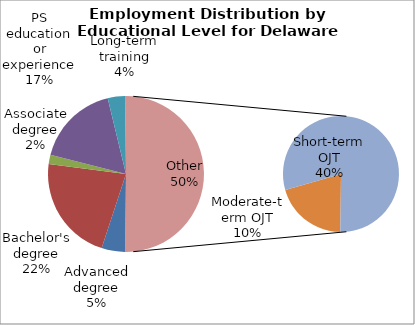
| Category | Series 0 |
|---|---|
| Advanced degree | 12430 |
| Bachelor's degree | 56220 |
| Associate degree | 5030 |
| PS education or experience | 44120 |
| Long-term training | 9150 |
| Moderate-term OJT | 26260 |
| Short-term OJT | 102660 |